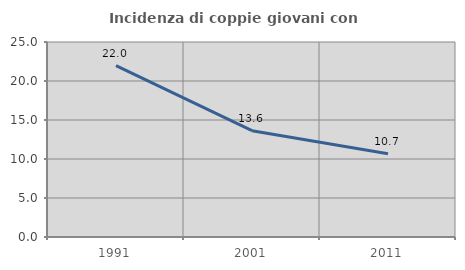
| Category | Incidenza di coppie giovani con figli |
|---|---|
| 1991.0 | 21.971 |
| 2001.0 | 13.625 |
| 2011.0 | 10.669 |